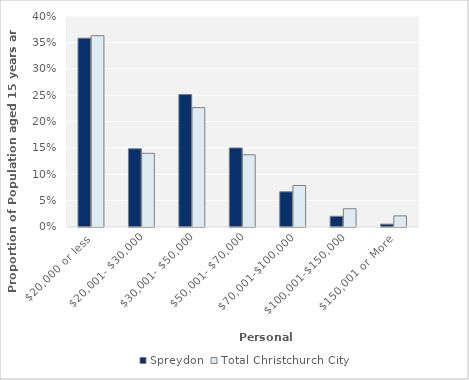
| Category | Spreydon | Total Christchurch City |
|---|---|---|
| $20,000 or less | 0.358 | 0.363 |
| $20,001- $30,000 | 0.148 | 0.14 |
| $30,001- $50,000 | 0.251 | 0.226 |
| $50,001- $70,000 | 0.15 | 0.137 |
| $70,001-$100,000 | 0.067 | 0.079 |
| $100,001-$150,000 | 0.02 | 0.035 |
| $150,001 or More | 0.005 | 0.021 |